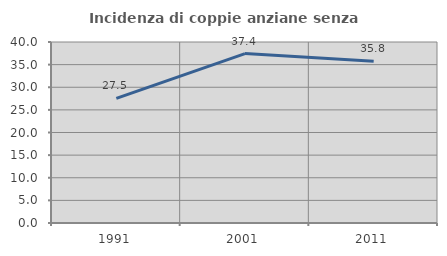
| Category | Incidenza di coppie anziane senza figli  |
|---|---|
| 1991.0 | 27.526 |
| 2001.0 | 37.445 |
| 2011.0 | 35.762 |